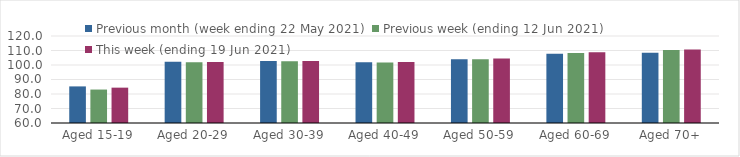
| Category | Previous month (week ending 22 May 2021) | Previous week (ending 12 Jun 2021) | This week (ending 19 Jun 2021) |
|---|---|---|---|
| Aged 15-19 | 85.24 | 83.07 | 84.38 |
| Aged 20-29 | 102.32 | 101.94 | 102.12 |
| Aged 30-39 | 102.83 | 102.52 | 102.73 |
| Aged 40-49 | 101.92 | 101.65 | 102.05 |
| Aged 50-59 | 103.88 | 104.03 | 104.49 |
| Aged 60-69 | 107.75 | 108.31 | 108.75 |
| Aged 70+ | 108.5 | 110.4 | 110.63 |